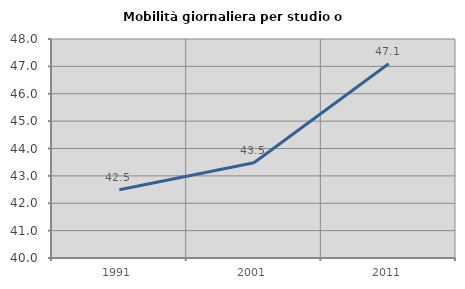
| Category | Mobilità giornaliera per studio o lavoro |
|---|---|
| 1991.0 | 42.496 |
| 2001.0 | 43.48 |
| 2011.0 | 47.096 |